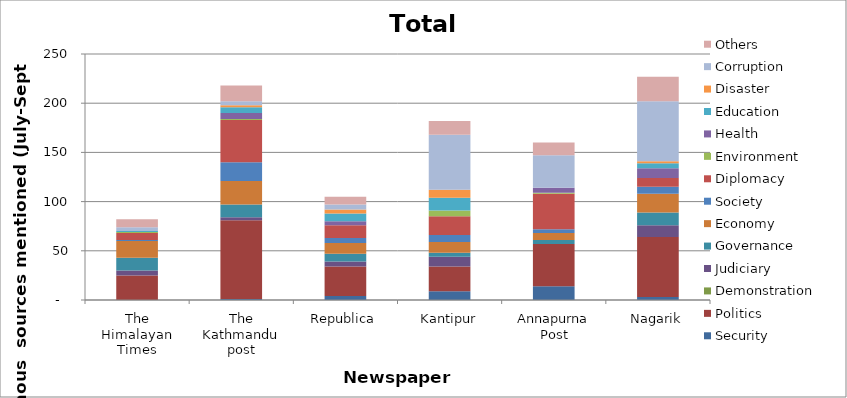
| Category | Security | Politics | Demonstration | Judiciary | Governance | Economy | Society | Diplomacy | Environment | Health | Education | Disaster | Corruption | Others |
|---|---|---|---|---|---|---|---|---|---|---|---|---|---|---|
| The Himalayan Times | 0 | 25 | 0 | 5 | 13 | 17 | 1 | 7 | 1 | 0 | 1 | 0 | 4 | 8 |
| The Kathmandu post | 1 | 80 | 0 | 3 | 13 | 24 | 19 | 43 | 1 | 6 | 6 | 2 | 4 | 16 |
| Republica | 4 | 30 | 0 | 5 | 8 | 11 | 5 | 13 | 0 | 4 | 8 | 4 | 5 | 8 |
| Kantipur | 9 | 25 | 0 | 10 | 4 | 11 | 7 | 19 | 6 | 0 | 13 | 8 | 56 | 14 |
| Annapurna Post | 14 | 43 | 0 | 0 | 4 | 7 | 4 | 36 | 1 | 5 | 0 | 0 | 33 | 13 |
| Nagarik | 3 | 61 | 0 | 12 | 13 | 19 | 7 | 9 | 0 | 10 | 5 | 2 | 61 | 25 |